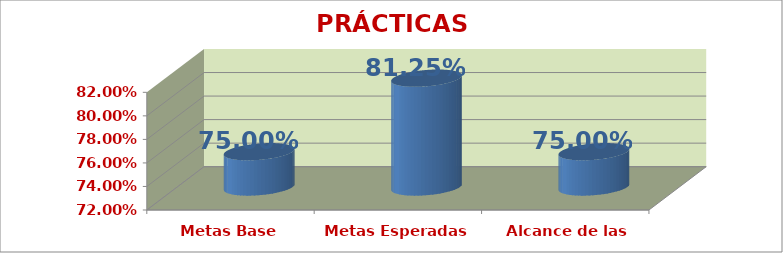
| Category | PRÁCTICAS PEDAGÓGICAS |
|---|---|
| Metas Base | 0.75 |
| Metas Esperadas | 0.812 |
| Alcance de las Metas | 0.75 |